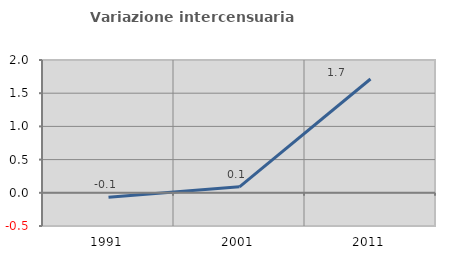
| Category | Variazione intercensuaria annua |
|---|---|
| 1991.0 | -0.069 |
| 2001.0 | 0.091 |
| 2011.0 | 1.714 |